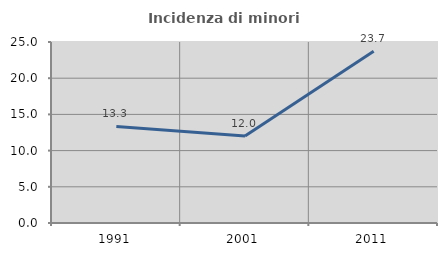
| Category | Incidenza di minori stranieri |
|---|---|
| 1991.0 | 13.333 |
| 2001.0 | 12 |
| 2011.0 | 23.72 |